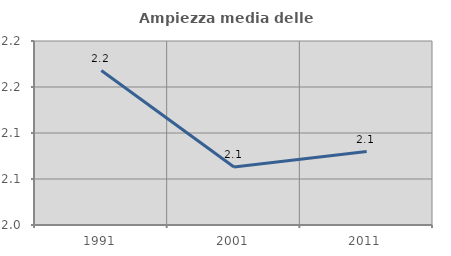
| Category | Ampiezza media delle famiglie |
|---|---|
| 1991.0 | 2.168 |
| 2001.0 | 2.063 |
| 2011.0 | 2.08 |